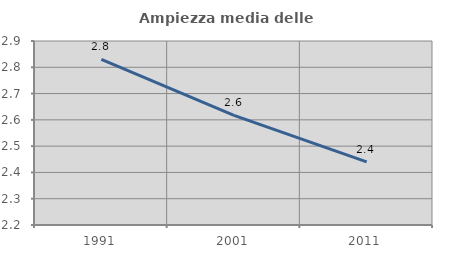
| Category | Ampiezza media delle famiglie |
|---|---|
| 1991.0 | 2.83 |
| 2001.0 | 2.617 |
| 2011.0 | 2.44 |